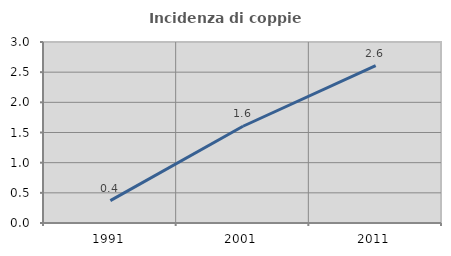
| Category | Incidenza di coppie miste |
|---|---|
| 1991.0 | 0.372 |
| 2001.0 | 1.604 |
| 2011.0 | 2.61 |